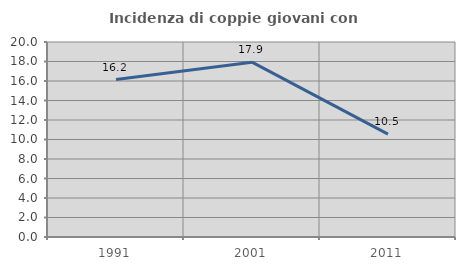
| Category | Incidenza di coppie giovani con figli |
|---|---|
| 1991.0 | 16.154 |
| 2001.0 | 17.933 |
| 2011.0 | 10.545 |